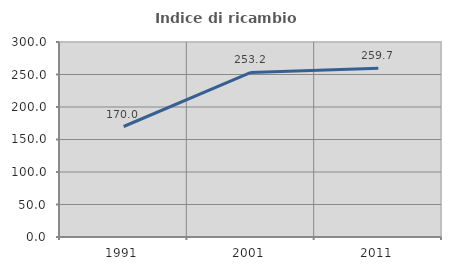
| Category | Indice di ricambio occupazionale  |
|---|---|
| 1991.0 | 170 |
| 2001.0 | 253.247 |
| 2011.0 | 259.74 |